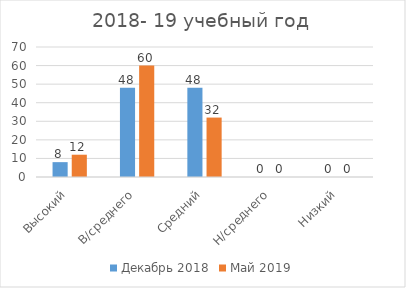
| Category | Декабрь 2018 | Май 2019 |
|---|---|---|
| Высокий | 8 | 12 |
| В/среднего | 48 | 60 |
| Средний | 48 | 32 |
| Н/среднего | 0 | 0 |
| Низкий | 0 | 0 |